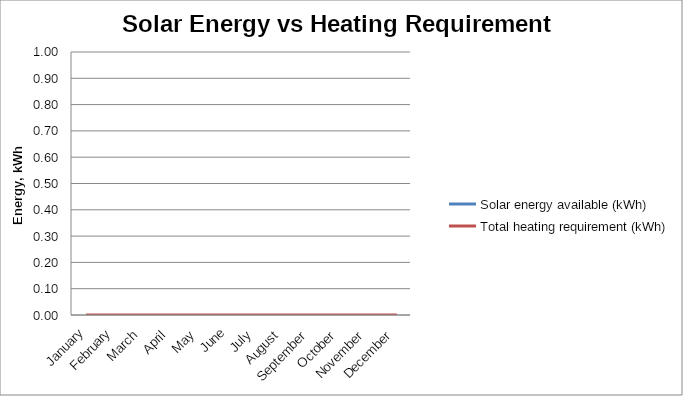
| Category | Solar energy available (kWh) | Total heating requirement (kWh) |
|---|---|---|
| January |  | 0 |
| February |  | 0 |
| March |  | 0 |
| April |  | 0 |
| May |  | 0 |
| June |  | 0 |
| July |  | 0 |
| August |  | 0 |
| September |  | 0 |
| October |  | 0 |
| November |  | 0 |
| December |  | 0 |